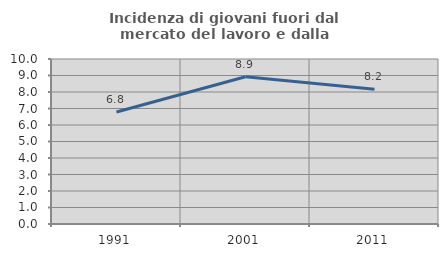
| Category | Incidenza di giovani fuori dal mercato del lavoro e dalla formazione  |
|---|---|
| 1991.0 | 6.789 |
| 2001.0 | 8.929 |
| 2011.0 | 8.17 |